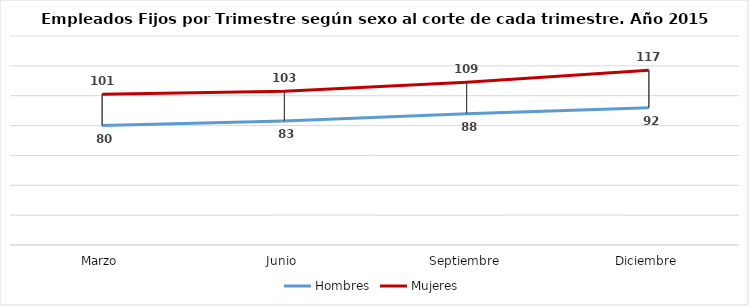
| Category | Hombres | Mujeres |
|---|---|---|
| Marzo | 80 | 101 |
| Junio | 83 | 103 |
| Septiembre | 88 | 109 |
| Diciembre | 92 | 117 |